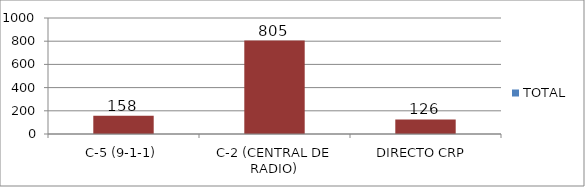
| Category | TOTAL |
|---|---|
| C-5 (9-1-1) | 158 |
| C-2 (CENTRAL DE RADIO) | 805 |
| DIRECTO CRP  | 126 |